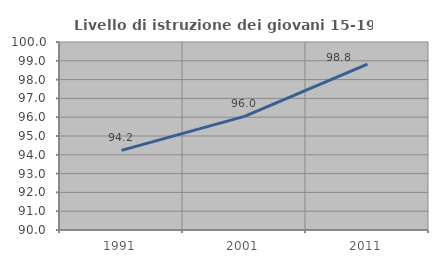
| Category | Livello di istruzione dei giovani 15-19 anni |
|---|---|
| 1991.0 | 94.235 |
| 2001.0 | 96.045 |
| 2011.0 | 98.827 |